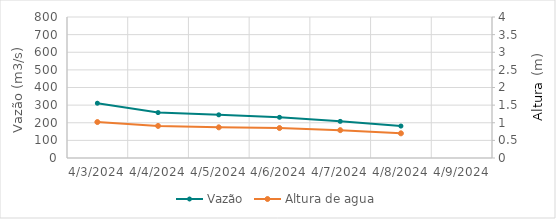
| Category | Vazão |
|---|---|
| 10/30/23 | 66.56 |
| 10/29/23 | 68.39 |
| 10/28/23 | 70.71 |
| 10/27/23 | 72.69 |
| 10/26/23 | 73.87 |
| 10/25/23 | 74.18 |
| 10/24/23 | 75.31 |